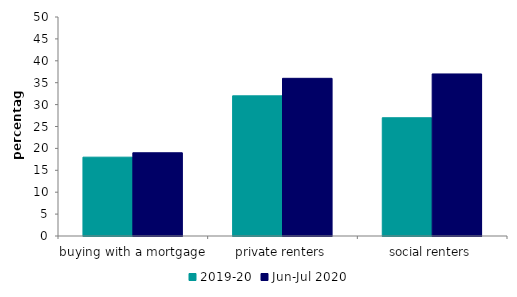
| Category | 2019-20 | Jun-Jul 2020 |
|---|---|---|
| buying with a mortgage | 18 | 19 |
| private renters | 32 | 36 |
| social renters | 27 | 37 |